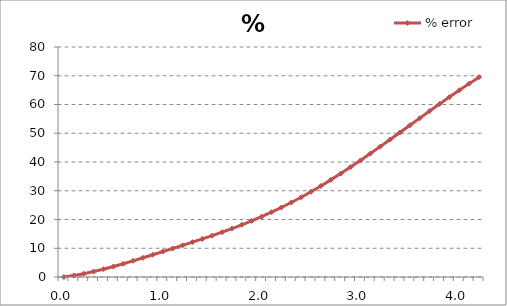
| Category | % error |
|---|---|
| 0.0 | 0 |
| 0.1 | 0.532 |
| 0.2 | 1.162 |
| 0.30000000000000004 | 1.893 |
| 0.4 | 2.718 |
| 0.5 | 3.627 |
| 0.6 | 4.603 |
| 0.7 | 5.629 |
| 0.7999999999999999 | 6.685 |
| 0.8999999999999999 | 7.759 |
| 0.9999999999999999 | 8.839 |
| 1.0999999999999999 | 9.924 |
| 1.2 | 11.014 |
| 1.3 | 12.116 |
| 1.4000000000000001 | 13.238 |
| 1.5000000000000002 | 14.391 |
| 1.6000000000000003 | 15.586 |
| 1.7000000000000004 | 16.833 |
| 1.8000000000000005 | 18.144 |
| 1.9000000000000006 | 19.527 |
| 2.0000000000000004 | 20.989 |
| 2.1000000000000005 | 22.538 |
| 2.2000000000000006 | 24.178 |
| 2.3000000000000007 | 25.911 |
| 2.400000000000001 | 27.74 |
| 2.500000000000001 | 29.663 |
| 2.600000000000001 | 31.677 |
| 2.700000000000001 | 33.779 |
| 2.800000000000001 | 35.963 |
| 2.9000000000000012 | 38.22 |
| 3.0000000000000013 | 40.543 |
| 3.1000000000000014 | 42.921 |
| 3.2000000000000015 | 45.345 |
| 3.3000000000000016 | 47.801 |
| 3.4000000000000017 | 50.279 |
| 3.5000000000000018 | 52.767 |
| 3.600000000000002 | 55.252 |
| 3.700000000000002 | 57.724 |
| 3.800000000000002 | 60.171 |
| 3.900000000000002 | 62.583 |
| 4.000000000000002 | 64.949 |
| 4.100000000000001 | 67.261 |
| 4.200000000000001 | 69.511 |